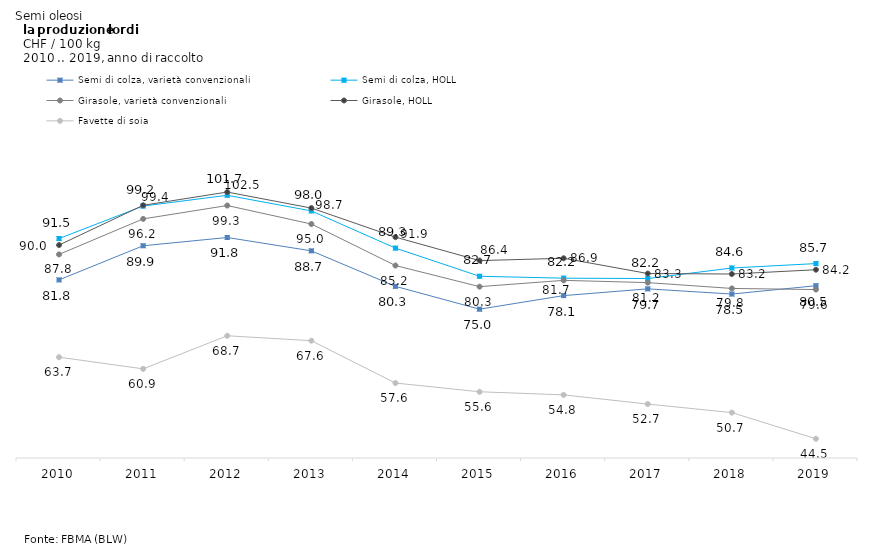
| Category | Semi di colza, varietà convenzionali | Semi di colza, HOLL | Girasole, varietà convenzionali | Girasole, HOLL | Favette di soia |
|---|---|---|---|---|---|
| 2010.0 | 81.84 | 91.547 | 87.824 | 90.022 | 63.685 |
| 2011.0 | 89.854 | 99.18 | 96.165 | 99.367 | 60.937 |
| 2012.0 | 91.796 | 101.712 | 99.308 | 102.469 | 68.713 |
| 2013.0 | 88.661 | 98.04 | 94.96 | 98.71 | 67.55 |
| 2014.0 | 80.32 | 89.3 | 85.21 | 91.88 | 57.61 |
| 2015.0 | 74.959 | 82.688 | 80.251 | 86.368 | 55.555 |
| 2016.0 | 78.143 | 82.24 | 81.725 | 86.919 | 54.829 |
| 2017.0 | 79.731 | 82.155 | 81.197 | 83.334 | 52.67 |
| 2018.0 | 78.509 | 84.629 | 79.83 | 83.215 | 50.665 |
| 2019.0 | 80.468 | 85.673 | 79.569 | 84.225 | 44.515 |